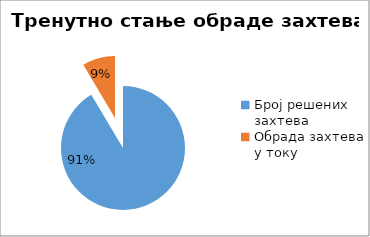
| Category | Series 0 |
|---|---|
| Број решених захтева | 20665 |
| Обрада захтева у току | 1932 |